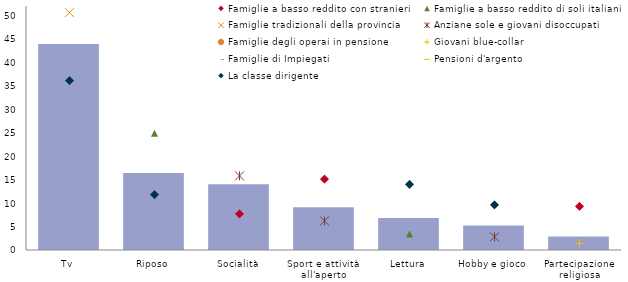
| Category | Totale |
|---|---|
| Tv | 43.9 |
| Riposo | 16.4 |
| Socialità | 14 |
| Sport e attività 
all'aperto | 9.1 |
| Lettura | 6.8 |
| Hobby e gioco | 5.2 |
| Partecipazione religiosa | 2.9 |